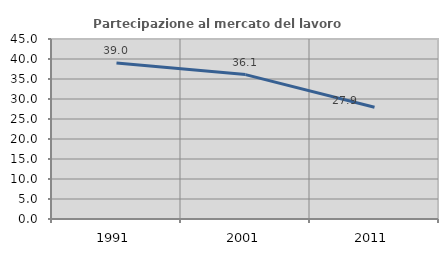
| Category | Partecipazione al mercato del lavoro  femminile |
|---|---|
| 1991.0 | 39.012 |
| 2001.0 | 36.103 |
| 2011.0 | 27.931 |